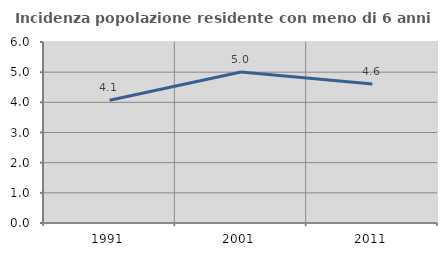
| Category | Incidenza popolazione residente con meno di 6 anni |
|---|---|
| 1991.0 | 4.067 |
| 2001.0 | 5.003 |
| 2011.0 | 4.609 |